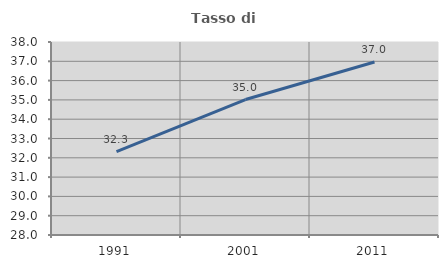
| Category | Tasso di occupazione   |
|---|---|
| 1991.0 | 32.317 |
| 2001.0 | 35.018 |
| 2011.0 | 36.964 |